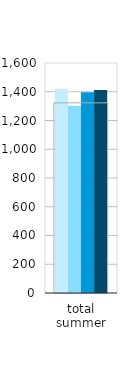
| Category | 2022 | 2023 | 2024 | 2025 |
|---|---|---|---|---|
| total summer | 1420.231 | 1302.714 | 1395.898 | 1411.498 |